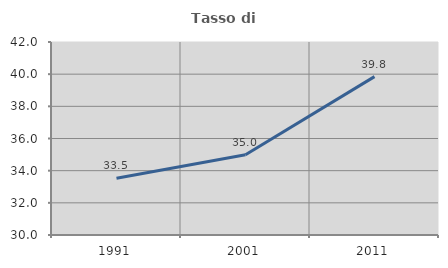
| Category | Tasso di occupazione   |
|---|---|
| 1991.0 | 33.524 |
| 2001.0 | 34.985 |
| 2011.0 | 39.846 |